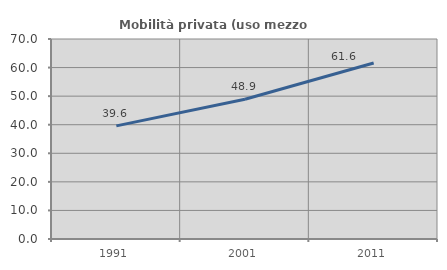
| Category | Mobilità privata (uso mezzo privato) |
|---|---|
| 1991.0 | 39.583 |
| 2001.0 | 48.926 |
| 2011.0 | 61.592 |